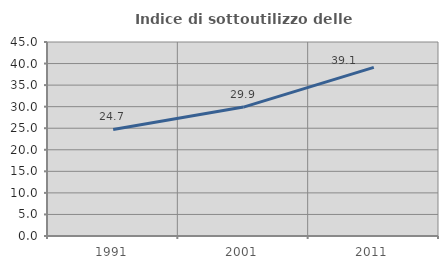
| Category | Indice di sottoutilizzo delle abitazioni  |
|---|---|
| 1991.0 | 24.727 |
| 2001.0 | 29.906 |
| 2011.0 | 39.125 |